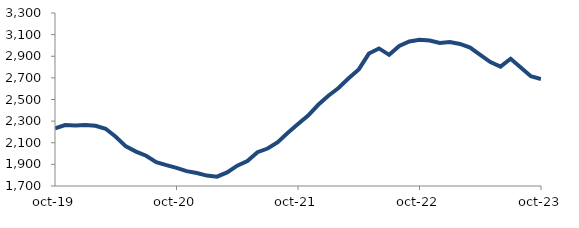
| Category | Series 0 |
|---|---|
| 2019-10-01 | 2233.304 |
| 2019-11-01 | 2263.898 |
| 2019-12-01 | 2259.926 |
| 2020-01-01 | 2265.053 |
| 2020-02-01 | 2256.766 |
| 2020-03-01 | 2229.161 |
| 2020-04-01 | 2155.791 |
| 2020-05-01 | 2066.843 |
| 2020-06-01 | 2018.026 |
| 2020-07-01 | 1979.558 |
| 2020-08-01 | 1920.368 |
| 2020-09-01 | 1893.237 |
| 2020-10-01 | 1867.4 |
| 2020-11-01 | 1837.195 |
| 2020-12-01 | 1819.546 |
| 2021-01-01 | 1796.45 |
| 2021-02-01 | 1786.603 |
| 2021-03-01 | 1826.072 |
| 2021-04-01 | 1887.798 |
| 2021-05-01 | 1930.372 |
| 2021-06-01 | 2012.926 |
| 2021-07-01 | 2046.434 |
| 2021-08-01 | 2105.806 |
| 2021-09-01 | 2192.514 |
| 2021-10-01 | 2272.972 |
| 2021-11-01 | 2351.334 |
| 2021-12-01 | 2451.171 |
| 2022-01-01 | 2534.613 |
| 2022-02-01 | 2606.357 |
| 2022-03-01 | 2696.948 |
| 2022-04-01 | 2778.264 |
| 2022-05-01 | 2924.682 |
| 2022-06-01 | 2972.281 |
| 2022-07-01 | 2912.933 |
| 2022-08-01 | 2994.913 |
| 2022-09-01 | 3036.467 |
| 2022-10-01 | 3052.236 |
| 2022-11-01 | 3044.767 |
| 2022-12-01 | 3023.141 |
| 2023-01-01 | 3030.956 |
| 2023-02-01 | 3013.674 |
| 2023-03-01 | 2979.861 |
| 2023-04-01 | 2913.014 |
| 2023-05-01 | 2845.832 |
| 2023-06-01 | 2803.594 |
| 2023-07-01 | 2876.7 |
| 2023-08-01 | 2796.297 |
| 2023-09-01 | 2715.691 |
| 2023-10-01 | 2689.066 |